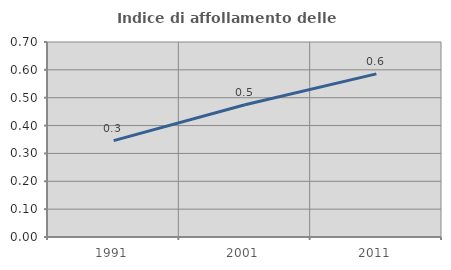
| Category | Indice di affollamento delle abitazioni  |
|---|---|
| 1991.0 | 0.346 |
| 2001.0 | 0.475 |
| 2011.0 | 0.586 |